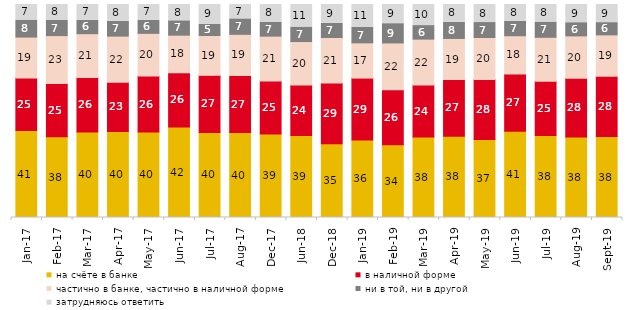
| Category | на счёте в банке | в наличной форме | частично в банке, частично в наличной форме | ни в той, ни в другой | затрудняюсь ответить |
|---|---|---|---|---|---|
| 2017-01-01 | 40.8 | 24.65 | 19.25 | 7.95 | 7.35 |
| 2017-02-01 | 37.9 | 25 | 22.5 | 7.1 | 7.5 |
| 2017-03-01 | 40.1 | 25.65 | 20.55 | 6.3 | 7.4 |
| 2017-04-01 | 40.4 | 23.05 | 21.7 | 6.95 | 7.9 |
| 2017-05-01 | 40.1 | 26.3 | 20.05 | 6.15 | 7.4 |
| 2017-06-01 | 42.45 | 25.5 | 17.65 | 6.75 | 7.65 |
| 2017-07-01 | 39.95 | 26.8 | 18.7 | 5.3 | 9.25 |
| 2017-08-01 | 39.85 | 26.8 | 19.35 | 7.25 | 6.75 |
| 2017-12-01 | 39.2 | 24.85 | 21.05 | 6.55 | 8.3 |
| 2018-06-01 | 38.5 | 23.65 | 20.45 | 6.8 | 10.6 |
| 2018-12-01 | 34.6 | 28.55 | 21.35 | 6.65 | 8.85 |
| 2019-01-01 | 36.35 | 29.1 | 16.55 | 7.35 | 10.65 |
| 2019-02-01 | 34.2 | 25.75 | 22 | 9.05 | 9 |
| 2019-03-01 | 37.842 | 24.316 | 21.581 | 6.365 | 9.896 |
| 2019-04-01 | 38.119 | 26.634 | 19.307 | 7.574 | 8.366 |
| 2019-05-01 | 36.652 | 28.083 | 19.762 | 7.033 | 8.47 |
| 2019-06-01 | 40.549 | 26.833 | 17.955 | 6.733 | 7.93 |
| 2019-07-01 | 38.465 | 25.495 | 20.644 | 7.129 | 8.267 |
| 2019-08-01 | 37.812 | 27.522 | 19.93 | 6.194 | 8.541 |
| 2019-09-01 | 37.97 | 28.366 | 19.406 | 5.743 | 8.515 |